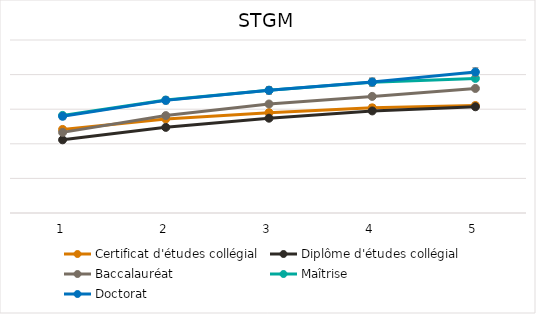
| Category | Certificat d'études collégial | Diplôme d'études collégial | Baccalauréat | Maîtrise | Doctorat |
|---|---|---|---|---|---|
| 1.0 | 48300 | 42300 | 46600 | 56400 | 55900 |
| 2.0 | 54400 | 49500 | 56300 | 65300 | 65100 |
| 3.0 | 58000 | 54800 | 63000 | 71000 | 70900 |
| 4.0 | 60800 | 59000 | 67400 | 75600 | 75700 |
| 5.0 | 62100 | 61400 | 72000 | 77800 | 81500 |